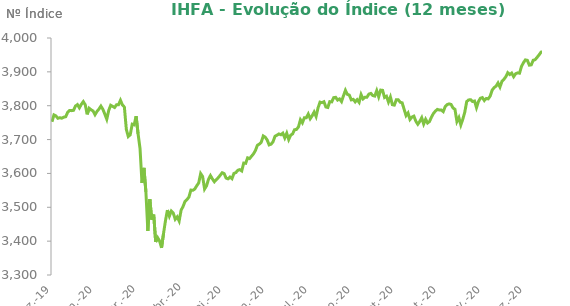
| Category | Series 0 |
|---|---|
| 2019-12-31 | 3752.54 |
| 2020-01-02 | 3772.81 |
| 2020-01-03 | 3769.9 |
| 2020-01-06 | 3762.86 |
| 2020-01-07 | 3764.55 |
| 2020-01-08 | 3763.17 |
| 2020-01-09 | 3766.14 |
| 2020-01-10 | 3767.44 |
| 2020-01-13 | 3780.38 |
| 2020-01-14 | 3785.89 |
| 2020-01-15 | 3785.45 |
| 2020-01-16 | 3786.31 |
| 2020-01-17 | 3799.03 |
| 2020-01-20 | 3803.26 |
| 2020-01-21 | 3793.75 |
| 2020-01-22 | 3804.19 |
| 2020-01-23 | 3812.05 |
| 2020-01-24 | 3802.67 |
| 2020-01-27 | 3774.41 |
| 2020-01-28 | 3792.54 |
| 2020-01-29 | 3787.85 |
| 2020-01-30 | 3784.48 |
| 2020-01-31 | 3773.49 |
| 2020-02-03 | 3783.16 |
| 2020-02-04 | 3789.99 |
| 2020-02-05 | 3798.85 |
| 2020-02-06 | 3789.54 |
| 2020-02-07 | 3775.27 |
| 2020-02-10 | 3760.15 |
| 2020-02-11 | 3786.03 |
| 2020-02-12 | 3801.34 |
| 2020-02-13 | 3798.07 |
| 2020-02-14 | 3794.75 |
| 2020-02-17 | 3802.89 |
| 2020-02-18 | 3802.88 |
| 2020-02-19 | 3816.08 |
| 2020-02-20 | 3802.31 |
| 2020-02-21 | 3796.11 |
| 2020-02-26 | 3730.01 |
| 2020-02-27 | 3708.93 |
| 2020-02-28 | 3714.42 |
| 2020-03-02 | 3745.36 |
| 2020-03-03 | 3743.47 |
| 2020-03-04 | 3769.15 |
| 2020-03-05 | 3717.08 |
| 2020-03-06 | 3673.81 |
| 2020-03-09 | 3571.77 |
| 2020-03-10 | 3616.39 |
| 2020-03-11 | 3545.79 |
| 2020-03-12 | 3430.04 |
| 2020-03-13 | 3524.29 |
| 2020-03-16 | 3463.36 |
| 2020-03-17 | 3478.44 |
| 2020-03-18 | 3397.62 |
| 2020-03-19 | 3410.26 |
| 2020-03-20 | 3400.6 |
| 2020-03-23 | 3380.23 |
| 2020-03-24 | 3422.13 |
| 2020-03-25 | 3460.08 |
| 2020-03-26 | 3491.76 |
| 2020-03-27 | 3473.82 |
| 2020-03-30 | 3488.84 |
| 2020-03-31 | 3482.69 |
| 2020-04-01 | 3464.66 |
| 2020-04-02 | 3471.63 |
| 2020-04-03 | 3459.45 |
| 2020-04-06 | 3491.37 |
| 2020-04-07 | 3502.44 |
| 2020-04-08 | 3517.42 |
| 2020-04-09 | 3522.58 |
| 2020-04-13 | 3530.2 |
| 2020-04-14 | 3550.84 |
| 2020-04-15 | 3550.16 |
| 2020-04-16 | 3554.02 |
| 2020-04-17 | 3563.62 |
| 2020-04-20 | 3572.06 |
| 2020-04-22 | 3599.5 |
| 2020-04-23 | 3590.7 |
| 2020-04-24 | 3553.96 |
| 2020-04-27 | 3563.46 |
| 2020-04-28 | 3582.75 |
| 2020-04-29 | 3593.61 |
| 2020-04-30 | 3583.65 |
| 2020-05-04 | 3575.37 |
| 2020-05-05 | 3581.44 |
| 2020-05-06 | 3587.63 |
| 2020-05-07 | 3594.54 |
| 2020-05-08 | 3602.11 |
| 2020-05-11 | 3599.47 |
| 2020-05-12 | 3586.3 |
| 2020-05-13 | 3584 |
| 2020-05-14 | 3589.31 |
| 2020-05-15 | 3584.44 |
| 2020-05-18 | 3599.99 |
| 2020-05-19 | 3602.49 |
| 2020-05-20 | 3609.25 |
| 2020-05-21 | 3611.21 |
| 2020-05-22 | 3607.41 |
| 2020-05-25 | 3630.63 |
| 2020-05-26 | 3629.82 |
| 2020-05-27 | 3646.06 |
| 2020-05-28 | 3643.92 |
| 2020-05-29 | 3650.81 |
| 2020-06-01 | 3657.86 |
| 2020-06-02 | 3667.86 |
| 2020-06-03 | 3683.17 |
| 2020-06-04 | 3686.68 |
| 2020-06-05 | 3692.61 |
| 2020-06-08 | 3710.65 |
| 2020-06-09 | 3707.06 |
| 2020-06-10 | 3698.77 |
| 2020-06-12 | 3684.29 |
| 2020-06-15 | 3686.41 |
| 2020-06-16 | 3693.57 |
| 2020-06-17 | 3709.78 |
| 2020-06-18 | 3712.96 |
| 2020-06-19 | 3716.59 |
| 2020-06-22 | 3714.3 |
| 2020-06-23 | 3718.92 |
| 2020-06-24 | 3704.84 |
| 2020-06-25 | 3718.72 |
| 2020-06-26 | 3700.07 |
| 2020-06-29 | 3712.85 |
| 2020-06-30 | 3716.91 |
| 2020-07-01 | 3729.12 |
| 2020-07-02 | 3730 |
| 2020-07-03 | 3737.58 |
| 2020-07-06 | 3758.49 |
| 2020-07-07 | 3749.55 |
| 2020-07-08 | 3764.34 |
| 2020-07-09 | 3764.21 |
| 2020-07-10 | 3775.51 |
| 2020-07-13 | 3761.57 |
| 2020-07-14 | 3770.34 |
| 2020-07-15 | 3781.38 |
| 2020-07-16 | 3768.15 |
| 2020-07-17 | 3793.61 |
| 2020-07-20 | 3810.59 |
| 2020-07-21 | 3809.03 |
| 2020-07-22 | 3811.91 |
| 2020-07-23 | 3796.29 |
| 2020-07-24 | 3794.76 |
| 2020-07-27 | 3812 |
| 2020-07-28 | 3811.34 |
| 2020-07-29 | 3823.88 |
| 2020-07-30 | 3824.8 |
| 2020-07-31 | 3816.68 |
| 2020-08-03 | 3820.06 |
| 2020-08-04 | 3812.26 |
| 2020-08-05 | 3829.22 |
| 2020-08-06 | 3845.41 |
| 2020-08-07 | 3833.55 |
| 2020-08-10 | 3831.33 |
| 2020-08-11 | 3817.21 |
| 2020-08-12 | 3818.92 |
| 2020-08-13 | 3811.41 |
| 2020-08-14 | 3817.89 |
| 2020-08-17 | 3809.92 |
| 2020-08-18 | 3833.05 |
| 2020-08-19 | 3820.12 |
| 2020-08-20 | 3825.3 |
| 2020-08-21 | 3825.31 |
| 2020-08-24 | 3834.3 |
| 2020-08-25 | 3836.4 |
| 2020-08-26 | 3830.04 |
| 2020-08-27 | 3828.46 |
| 2020-08-28 | 3844.48 |
| 2020-08-31 | 3826.39 |
| 2020-09-01 | 3846.14 |
| 2020-09-02 | 3845.4 |
| 2020-09-03 | 3824.38 |
| 2020-09-04 | 3827.94 |
| 2020-09-08 | 3810.96 |
| 2020-09-09 | 3825.78 |
| 2020-09-10 | 3803.03 |
| 2020-09-11 | 3801.82 |
| 2020-09-14 | 3817.47 |
| 2020-09-15 | 3817.64 |
| 2020-09-16 | 3810.27 |
| 2020-09-17 | 3808.54 |
| 2020-09-18 | 3789.61 |
| 2020-09-21 | 3770.85 |
| 2020-09-22 | 3778.58 |
| 2020-09-23 | 3759.35 |
| 2020-09-24 | 3766.39 |
| 2020-09-25 | 3769.15 |
| 2020-09-28 | 3754.15 |
| 2020-09-29 | 3745.23 |
| 2020-09-30 | 3753.64 |
| 2020-10-01 | 3764.5 |
| 2020-10-02 | 3745.97 |
| 2020-10-05 | 3760.02 |
| 2020-10-06 | 3748.99 |
| 2020-10-07 | 3753.5 |
| 2020-10-08 | 3766.65 |
| 2020-10-09 | 3777.19 |
| 2020-10-13 | 3784.1 |
| 2020-10-14 | 3789.08 |
| 2020-10-15 | 3787.5 |
| 2020-10-16 | 3787.18 |
| 2020-10-19 | 3782.57 |
| 2020-10-20 | 3797.23 |
| 2020-10-21 | 3803.26 |
| 2020-10-22 | 3805.46 |
| 2020-10-23 | 3803.83 |
| 2020-10-26 | 3793.41 |
| 2020-10-27 | 3789.23 |
| 2020-10-28 | 3753.16 |
| 2020-10-29 | 3765 |
| 2020-10-30 | 3743.2 |
| 2020-11-03 | 3760.2 |
| 2020-11-04 | 3780.52 |
| 2020-11-05 | 3812.25 |
| 2020-11-06 | 3817.11 |
| 2020-11-09 | 3817.77 |
| 2020-11-10 | 3812.47 |
| 2020-11-11 | 3813.86 |
| 2020-11-12 | 3794.28 |
| 2020-11-13 | 3812.36 |
| 2020-11-16 | 3822.16 |
| 2020-11-17 | 3824.03 |
| 2020-11-18 | 3815.25 |
| 2020-11-19 | 3821.41 |
| 2020-11-20 | 3820.26 |
| 2020-11-23 | 3828.39 |
| 2020-11-24 | 3845.88 |
| 2020-11-25 | 3853.47 |
| 2020-11-26 | 3857.65 |
| 2020-11-27 | 3867.12 |
| 2020-11-30 | 3855.05 |
| 2020-12-01 | 3871.75 |
| 2020-12-02 | 3877.88 |
| 2020-12-03 | 3885.5 |
| 2020-12-04 | 3897.62 |
| 2020-12-07 | 3892.04 |
| 2020-12-08 | 3896.42 |
| 2020-12-09 | 3885.78 |
| 2020-12-10 | 3894.3 |
| 2020-12-11 | 3897.04 |
| 2020-12-14 | 3896.11 |
| 2020-12-15 | 3915.91 |
| 2020-12-16 | 3927.07 |
| 2020-12-17 | 3935.34 |
| 2020-12-18 | 3934.05 |
| 2020-12-21 | 3919.86 |
| 2020-12-22 | 3920.69 |
| 2020-12-23 | 3934.3 |
| 2020-12-24 | 3936.01 |
| 2020-12-28 | 3942.95 |
| 2020-12-29 | 3950.19 |
| 2020-12-30 | 3958.34 |
| 2020-12-31 | 3959.42 |